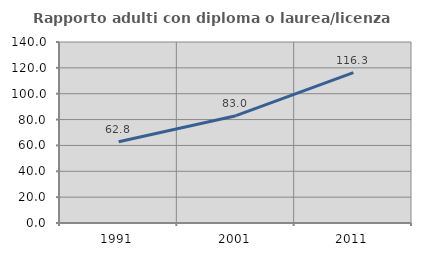
| Category | Rapporto adulti con diploma o laurea/licenza media  |
|---|---|
| 1991.0 | 62.84 |
| 2001.0 | 83.017 |
| 2011.0 | 116.333 |